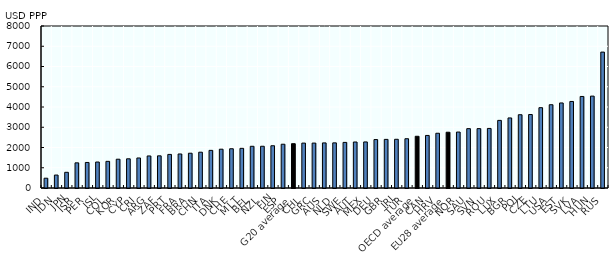
| Category | Series 0 |
|---|---|
| IND | 483.347 |
| IDN | 639.255 |
| JPN | 774.725 |
| ISR | 1242.199 |
| PER | 1261.029 |
| ISL | 1282.974 |
| COL | 1315.729 |
| KOR | 1421.527 |
| CYP | 1441.459 |
| CRI | 1483.023 |
| ARG | 1582.466 |
| ZAF | 1588.426 |
| PRT | 1658.311 |
| FRA | 1680.405 |
| BRA | 1717.395 |
| CHN | 1768.461 |
| ITA | 1858.384 |
| DNK | 1916.215 |
| CHE | 1938.37 |
| MLT | 1958.579 |
| BEL | 2059.809 |
| NZL | 2061.349 |
| FIN | 2087.158 |
| ESP | 2161.39 |
| G20 average | 2189.02 |
| CHL | 2217.338 |
| GRC | 2218.125 |
| AUS | 2226.696 |
| NLD | 2228.744 |
| SWE | 2251.98 |
| AUT | 2270.885 |
| MEX | 2274.235 |
| DEU | 2391.965 |
| GBR | 2400.95 |
| IRL | 2405.485 |
| TUR | 2432.921 |
| OECD average | 2554.123 |
| CAN | 2595.458 |
| HRV | 2703.695 |
| EU28 average | 2753.913 |
| NOR | 2763.094 |
| SAU | 2931.088 |
| SVN | 2931.896 |
| ROU | 2941.507 |
| LUX | 3339.475 |
| BGR | 3459.113 |
| POL | 3618.246 |
| CZE | 3628.452 |
| LTU | 3966.103 |
| USA | 4112.31 |
| EST | 4199.471 |
| SVK | 4273.912 |
| LVA | 4520.114 |
| HUN | 4537.744 |
| RUS | 6711.371 |